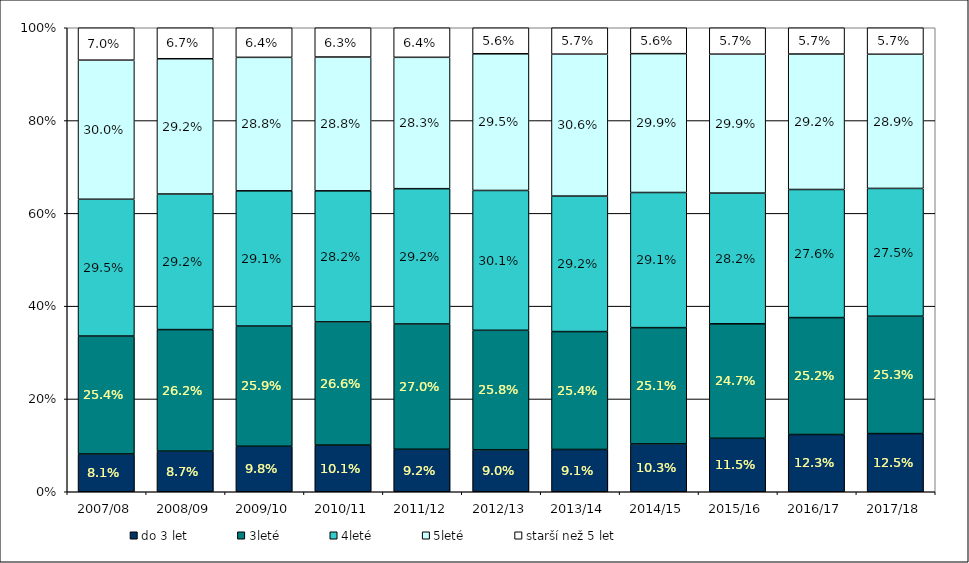
| Category | do 3 let | 3leté | 4leté | 5leté | starší než 5 let |
|---|---|---|---|---|---|
| 2007/08 | 0.081 | 0.254 | 0.295 | 0.3 | 0.07 |
| 2008/09 | 0.087 | 0.262 | 0.292 | 0.292 | 0.067 |
| 2009/10 | 0.098 | 0.259 | 0.291 | 0.288 | 0.064 |
| 2010/11 | 0.101 | 0.266 | 0.282 | 0.288 | 0.063 |
| 2011/12 | 0.092 | 0.27 | 0.292 | 0.283 | 0.064 |
| 2012/13 | 0.09 | 0.258 | 0.301 | 0.295 | 0.056 |
| 2013/14 | 0.091 | 0.254 | 0.292 | 0.306 | 0.057 |
| 2014/15 | 0.103 | 0.251 | 0.291 | 0.299 | 0.056 |
| 2015/16 | 0.115 | 0.247 | 0.282 | 0.299 | 0.057 |
| 2016/17 | 0.123 | 0.252 | 0.276 | 0.292 | 0.057 |
| 2017/18 | 0.125 | 0.253 | 0.275 | 0.289 | 0.057 |